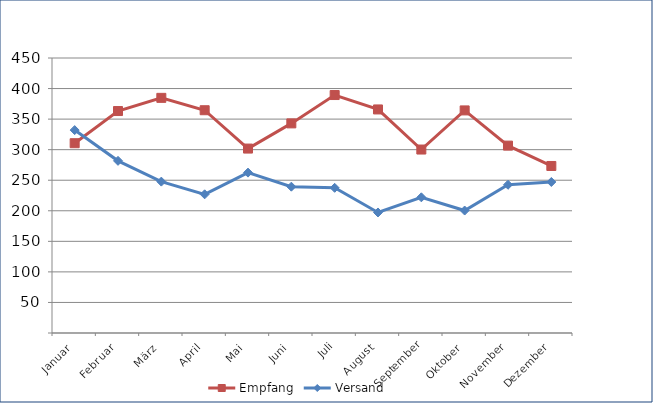
| Category | Empfang | Versand |
|---|---|---|
| Januar | 310.571 | 332.035 |
| Februar | 363.206 | 281.712 |
| März | 384.776 | 247.712 |
| April | 364.536 | 226.939 |
| Mai | 301.799 | 262.456 |
| Juni | 343.01 | 239.434 |
| Juli | 389.393 | 237.574 |
| August | 365.824 | 197.223 |
| September | 300.22 | 222.012 |
| Oktober | 364.243 | 200.385 |
| November | 306.631 | 242.573 |
| Dezember | 273.31 | 247.129 |